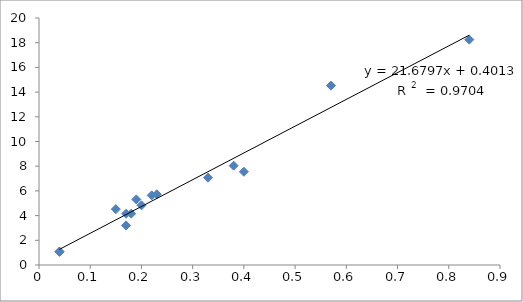
| Category | Series 0 |
|---|---|
| 0.03999999999999998 | 1.094 |
| 0.040000000000000036 | 1.057 |
| 0.16999999999999993 | 3.205 |
| 0.17000000000000037 | 4.155 |
| 0.17999999999999972 | 4.155 |
| 0.20000000000000018 | 4.831 |
| 0.1499999999999999 | 4.524 |
| 0.22000000000000064 | 5.641 |
| 0.1900000000000004 | 5.309 |
| 0.23000000000000043 | 5.726 |
| 0.40000000000000036 | 7.548 |
| 0.33000000000000007 | 7.069 |
| 0.3799999999999999 | 8.042 |
| 0.5700000000000003 | 14.522 |
| 0.8399999999999999 | 18.247 |